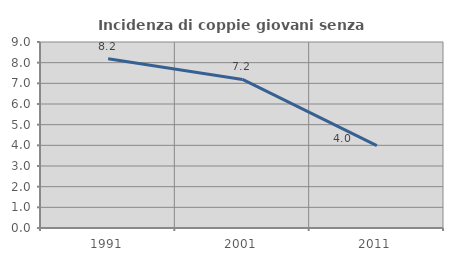
| Category | Incidenza di coppie giovani senza figli |
|---|---|
| 1991.0 | 8.186 |
| 2001.0 | 7.19 |
| 2011.0 | 3.982 |